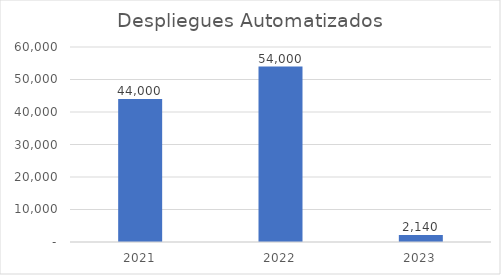
| Category | Series 0 |
|---|---|
| 2021.0 | 44000 |
| 2022.0 | 54000 |
| 2023.0 | 2140 |